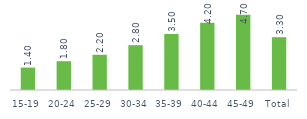
| Category | Total |
|---|---|
| 15-19 | 1.4 |
| 20-24 | 1.8 |
| 25-29 | 2.2 |
| 30-34 | 2.8 |
| 35-39 | 3.5 |
| 40-44 | 4.2 |
| 45-49 | 4.7 |
| Total | 3.3 |